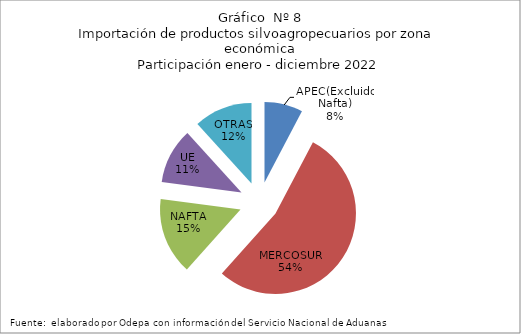
| Category | Series 0 |
|---|---|
| APEC(Excluido Nafta) | 751322.148 |
| MERCOSUR | 5262806.944 |
| NAFTA | 1512541.868 |
| UE | 1090220.237 |
| OTRAS | 1144851.803 |